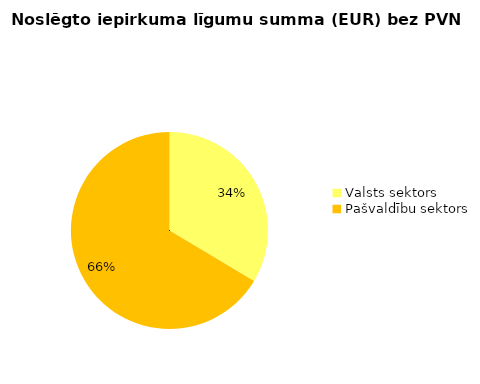
| Category | Noslēgto iepirkuma līgumu summa (EUR) bez PVN |
|---|---|
| Valsts sektors | 3299494 |
| Pašvaldību sektors | 6529137 |